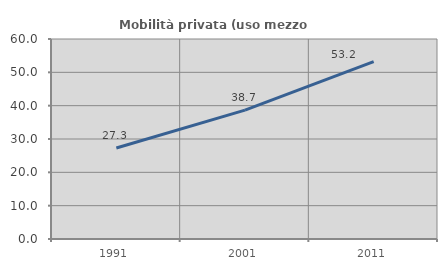
| Category | Mobilità privata (uso mezzo privato) |
|---|---|
| 1991.0 | 27.306 |
| 2001.0 | 38.651 |
| 2011.0 | 53.186 |